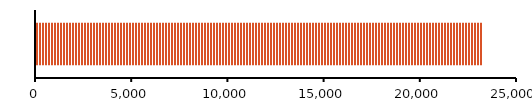
| Category | TOTAL DE ATIVOS |
|---|---|
| 0 | 23216 |